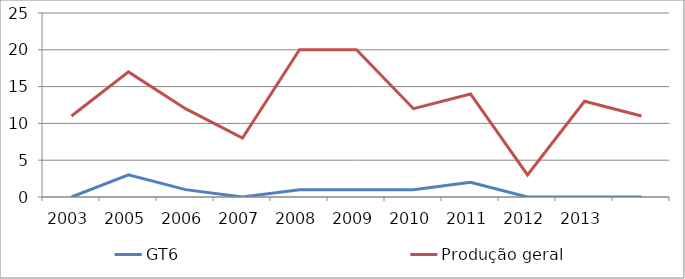
| Category | GT6 | Produção geral |
|---|---|---|
| 2003.0 | 0 | 11 |
| 2005.0 | 3 | 17 |
| 2006.0 | 1 | 12 |
| 2007.0 | 0 | 8 |
| 2008.0 | 1 | 20 |
| 2009.0 | 1 | 20 |
| 2010.0 | 1 | 12 |
| 2011.0 | 2 | 14 |
| 2012.0 | 0 | 3 |
| 2013.0 | 0 | 13 |